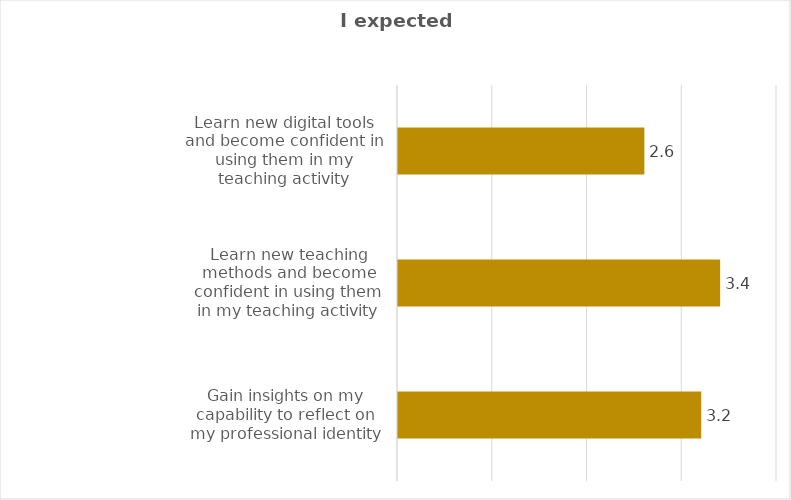
| Category | Series 0 |
|---|---|
| Gain insights on my capability to reflect on my professional identity | 3.2 |
| Learn new teaching methods and become confident in using them in my teaching activity | 3.4 |
| Learn new digital tools and become confident in using them in my teaching activity | 2.6 |